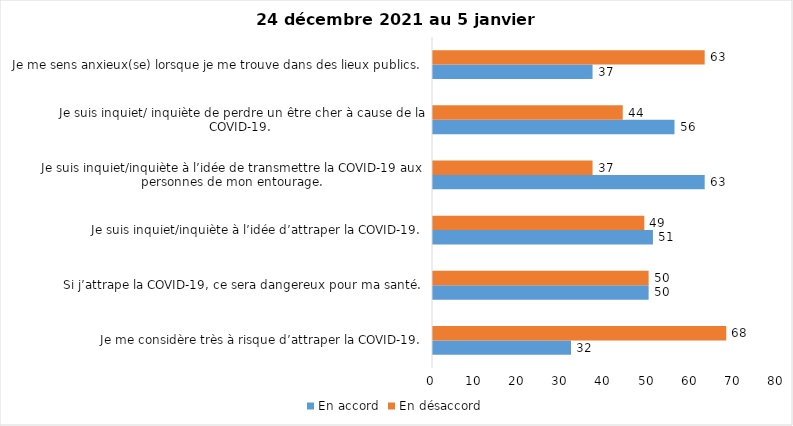
| Category | En accord | En désaccord |
|---|---|---|
| Je me considère très à risque d’attraper la COVID-19. | 32 | 68 |
| Si j’attrape la COVID-19, ce sera dangereux pour ma santé. | 50 | 50 |
| Je suis inquiet/inquiète à l’idée d’attraper la COVID-19. | 51 | 49 |
| Je suis inquiet/inquiète à l’idée de transmettre la COVID-19 aux personnes de mon entourage. | 63 | 37 |
| Je suis inquiet/ inquiète de perdre un être cher à cause de la COVID-19. | 56 | 44 |
| Je me sens anxieux(se) lorsque je me trouve dans des lieux publics. | 37 | 63 |